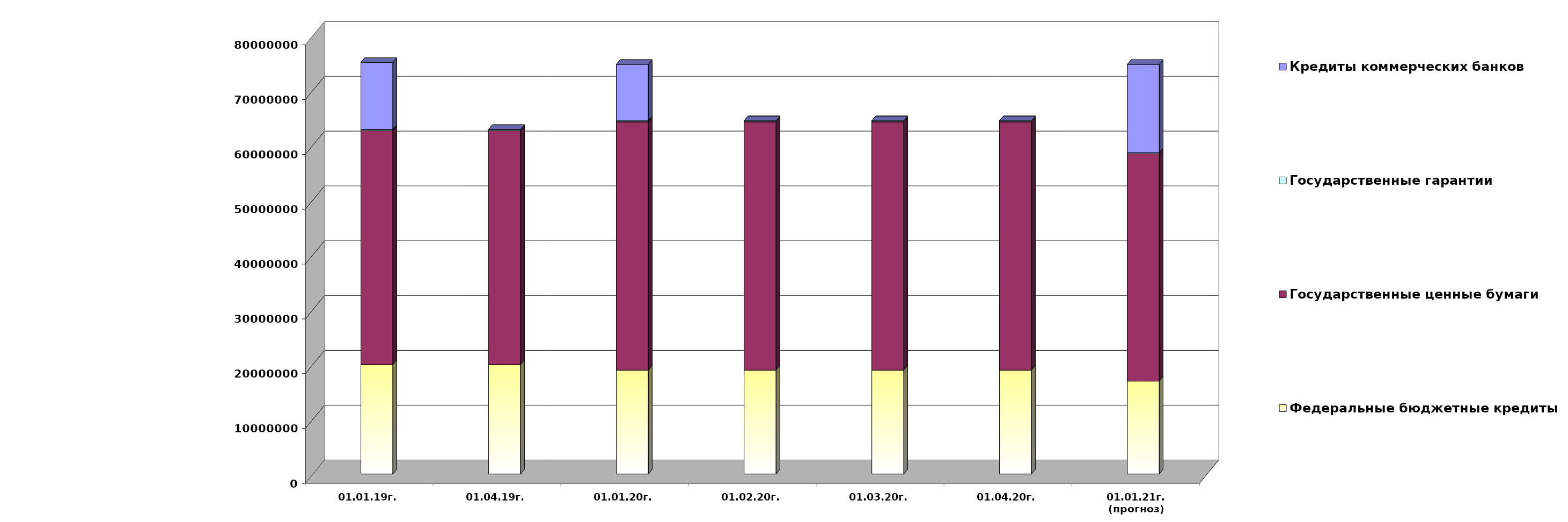
| Category | Федеральные бюджетные кредиты | Государственные ценные бумаги  | Государственные гарантии | Кредиты коммерческих банков |
|---|---|---|---|---|
| 01.01.19г. | 19957026.213 | 42700000 | 209872.86 | 12219963.75 |
| 01.04.19г. | 19957026.213 | 42700000 | 200735.86 | 0 |
| 01.01.20г. | 18954967.463 | 45300000 | 186330.02 | 10291177 |
| 01.02.20г. | 18954967.463 | 45300000 | 184738.25 | 0 |
| 01.03.20г. | 18954967.463 | 45300000 | 184738.25 | 0 |
| 01.04.20г. | 18954967.463 | 45300000 | 184738.25 | 0 |
| 01.01.21г.
(прогноз) | 16950850 | 41500000 | 179496.4 | 16097210.1 |